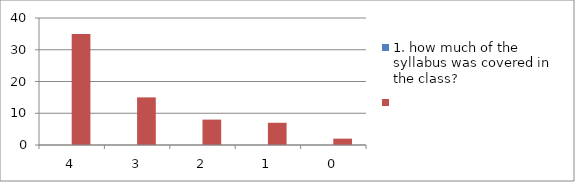
| Category | 1. how much of the syllabus was covered in the class? | Series 1 |
|---|---|---|
| 4.0 | 0 | 35 |
| 3.0 | 0 | 15 |
| 2.0 | 0 | 8 |
| 1.0 | 0 | 7 |
| 0.0 | 0 | 2 |